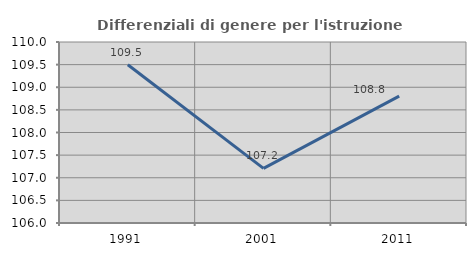
| Category | Differenziali di genere per l'istruzione superiore |
|---|---|
| 1991.0 | 109.498 |
| 2001.0 | 107.206 |
| 2011.0 | 108.803 |